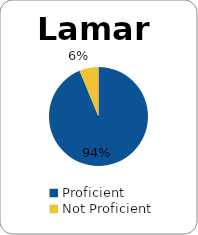
| Category | Series 0 |
|---|---|
| Proficient | 0.938 |
| Not Proficient | 0.062 |